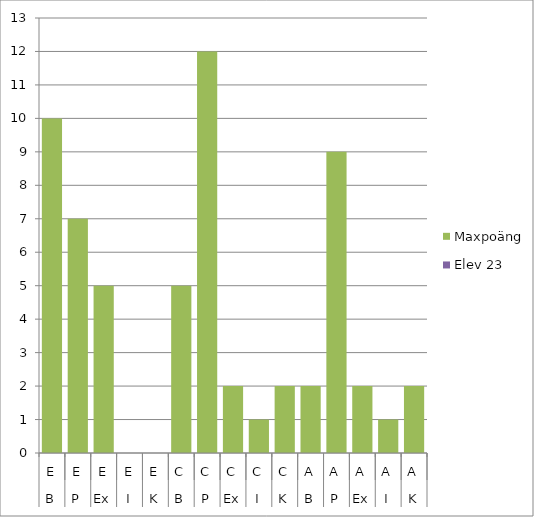
| Category | Maxpoäng | Elev 23 |
|---|---|---|
| 0 | 10 | 0 |
| 1 | 7 | 0 |
| 2 | 5 | 0 |
| 3 | 0 | 0 |
| 4 | 0 | 0 |
| 5 | 5 | 0 |
| 6 | 12 | 0 |
| 7 | 2 | 0 |
| 8 | 1 | 0 |
| 9 | 2 | 0 |
| 10 | 2 | 0 |
| 11 | 9 | 0 |
| 12 | 2 | 0 |
| 13 | 1 | 0 |
| 14 | 2 | 0 |